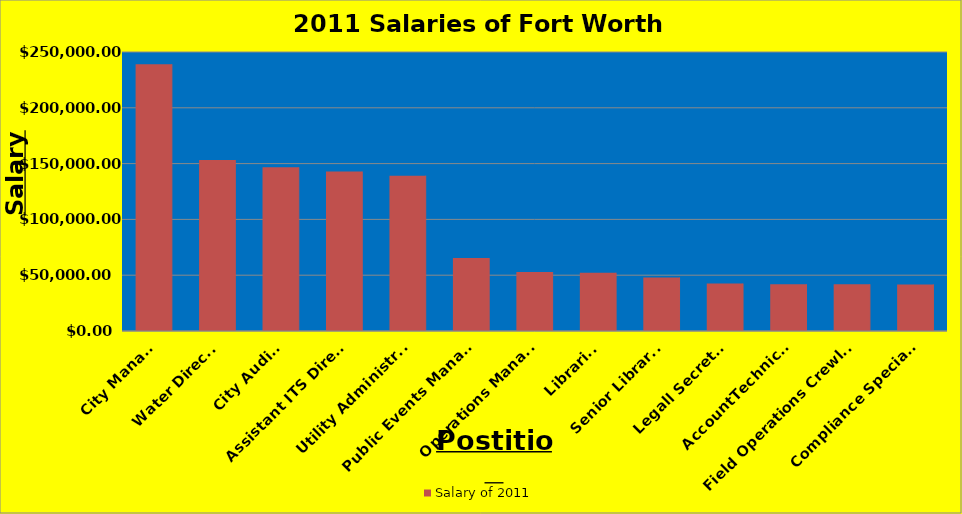
| Category | Salary of 2011 |
|---|---|
| City Manager | 239057.725 |
| Water Director | 153240.88 |
| City Auditor | 146695.64 |
| Assistant ITS Director | 142877.595 |
| Utility Administrator | 139190.37 |
| Public Events Manager | 65418.44 |
| Operations Manager | 52862.885 |
| Librarian | 52241.28 |
| Senior Librarian | 47947.64 |
| Legall Secretary | 42505.95 |
| AccountTechnician | 41901.6 |
| Field Operations Crewleader | 41879.76 |
| Compliance Specialist | 41771.6 |